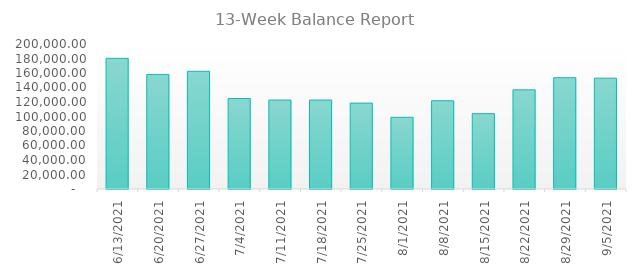
| Category | Value |
|---|---|
| 6/13/21 | 180250.779 |
| 6/20/21 | 158014.569 |
| 6/27/21 | 162344.569 |
| 7/4/21 | 124785.949 |
| 7/11/21 | 122706.975 |
| 7/18/21 | 122706.975 |
| 7/25/21 | 118486.26 |
| 8/1/21 | 98888.582 |
| 8/8/21 | 121719.154 |
| 8/15/21 | 103909.63 |
| 8/22/21 | 136769.204 |
| 8/29/21 | 153550.702 |
| 9/5/21 | 152855.038 |